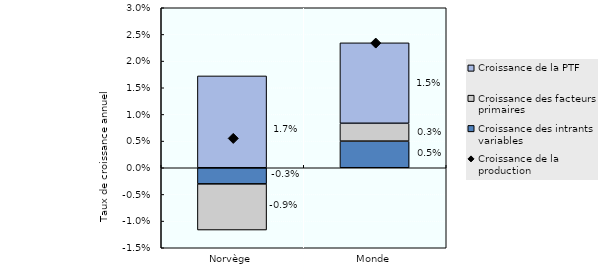
| Category | Croissance des intrants variables | Croissance des facteurs primaires | Croissance de la PTF |
|---|---|---|---|
| Norvège | -0.003 | -0.009 | 0.017 |
| Monde | 0.005 | 0.003 | 0.015 |